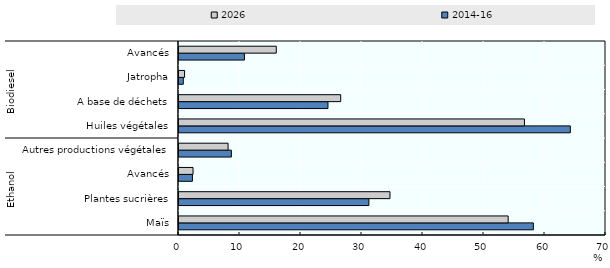
| Category | 2014-16 | 2026 |
|---|---|---|
| 0 | 58.09 | 53.962 |
| 1 | 31.127 | 34.589 |
| 2 | 2.197 | 2.301 |
| 3 | 8.585 | 8.046 |
| 4 | 64.15 | 56.628 |
| 5 | 24.419 | 26.512 |
| 6 | 0.702 | 0.914 |
| 7 | 10.728 | 15.947 |